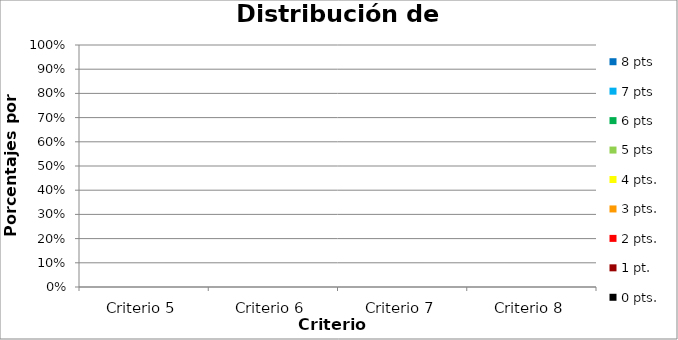
| Category | 8 pts | 7 pts | 6 pts | 5 pts | 4 pts. | 3 pts. | 2 pts. | 1 pt. | 0 pts. |
|---|---|---|---|---|---|---|---|---|---|
| Criterio 5 | 0 | 0 | 0 | 0 | 0 | 0 | 0 | 0 | 0 |
| Criterio 6 | 0 | 0 | 0 | 0 | 0 | 0 | 0 | 0 | 0 |
| Criterio 7 | 0 | 0 | 0 | 0 | 0 | 0 | 0 | 0 | 0 |
| Criterio 8 | 0 | 0 | 0 | 0 | 0 | 0 | 0 | 0 | 0 |